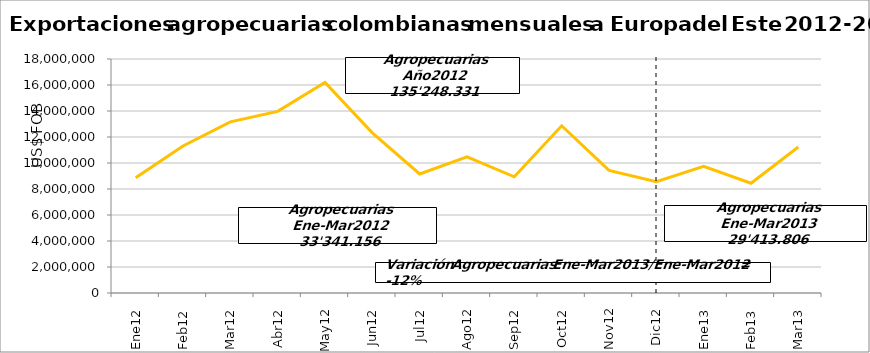
| Category | Series 0 |
|---|---|
| 0 | 8863351 |
| 1 | 11313115 |
| 2 | 13164690 |
| 3 | 13972650 |
| 4 | 16198544 |
| 5 | 12317548 |
| 6 | 9160139 |
| 7 | 10464762 |
| 8 | 8935908 |
| 9 | 12863758 |
| 10 | 9426705 |
| 11 | 8567161 |
| 12 | 9741847.17 |
| 13 | 8444275.6 |
| 14 | 11227682.76 |